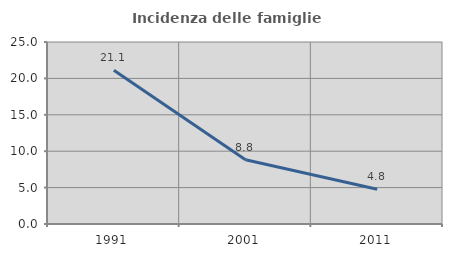
| Category | Incidenza delle famiglie numerose |
|---|---|
| 1991.0 | 21.127 |
| 2001.0 | 8.824 |
| 2011.0 | 4.762 |